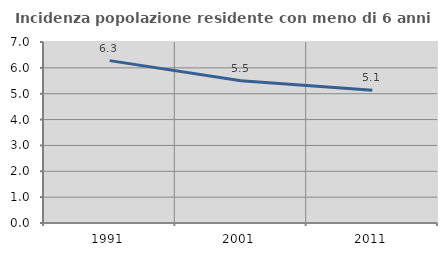
| Category | Incidenza popolazione residente con meno di 6 anni |
|---|---|
| 1991.0 | 6.28 |
| 2001.0 | 5.503 |
| 2011.0 | 5.131 |